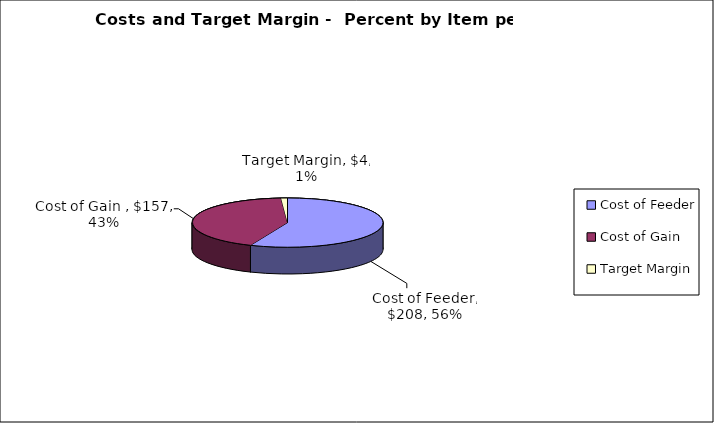
| Category | Series 0 |
|---|---|
| Cost of Feeder | 208.33 |
| Cost of Gain  | 157.466 |
| Target Margin | 4 |